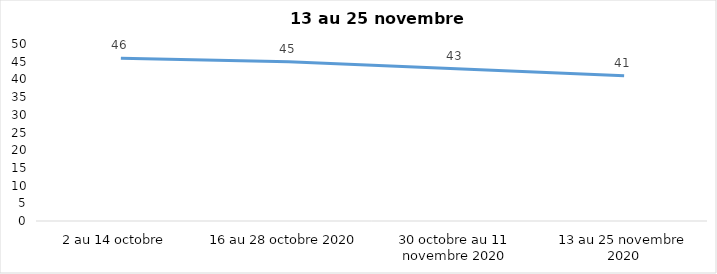
| Category | Series 0 |
|---|---|
| 2 au 14 octobre  | 46 |
| 16 au 28 octobre 2020 | 45 |
| 30 octobre au 11 novembre 2020 | 43 |
| 13 au 25 novembre 2020 | 41 |